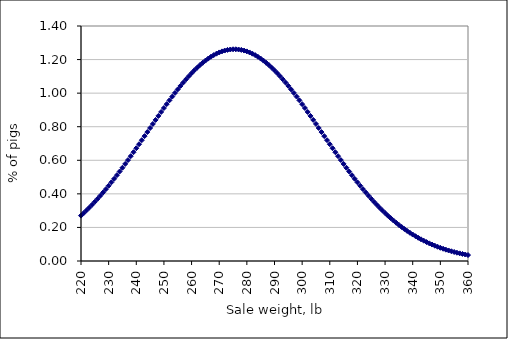
| Category | Series 0 |
|---|---|
| 150.0 | 0.004 |
| 151.0 | 0.001 |
| 152.0 | 0.001 |
| 153.0 | 0.001 |
| 154.0 | 0.001 |
| 155.0 | 0.001 |
| 156.0 | 0.001 |
| 157.0 | 0.001 |
| 158.0 | 0.001 |
| 159.0 | 0.001 |
| 160.0 | 0.002 |
| 161.0 | 0.002 |
| 162.0 | 0.002 |
| 163.0 | 0.002 |
| 164.0 | 0.003 |
| 165.0 | 0.003 |
| 166.0 | 0.003 |
| 167.0 | 0.004 |
| 168.0 | 0.004 |
| 169.0 | 0.004 |
| 170.0 | 0.005 |
| 171.0 | 0.005 |
| 172.0 | 0.006 |
| 173.0 | 0.007 |
| 174.0 | 0.007 |
| 175.0 | 0.008 |
| 176.0 | 0.009 |
| 177.0 | 0.01 |
| 178.0 | 0.011 |
| 179.0 | 0.012 |
| 180.0 | 0.013 |
| 181.0 | 0.015 |
| 182.0 | 0.016 |
| 183.0 | 0.018 |
| 184.0 | 0.019 |
| 185.0 | 0.021 |
| 186.0 | 0.023 |
| 187.0 | 0.025 |
| 188.0 | 0.027 |
| 189.0 | 0.03 |
| 190.0 | 0.033 |
| 191.0 | 0.036 |
| 192.0 | 0.039 |
| 193.0 | 0.042 |
| 194.0 | 0.046 |
| 195.0 | 0.049 |
| 196.0 | 0.054 |
| 197.0 | 0.058 |
| 198.0 | 0.063 |
| 199.0 | 0.068 |
| 200.0 | 0.073 |
| 201.0 | 0.079 |
| 202.0 | 0.085 |
| 203.0 | 0.091 |
| 204.0 | 0.098 |
| 205.0 | 0.105 |
| 206.0 | 0.113 |
| 207.0 | 0.121 |
| 208.0 | 0.129 |
| 209.0 | 0.138 |
| 210.0 | 0.148 |
| 211.0 | 0.158 |
| 212.0 | 0.168 |
| 213.0 | 0.179 |
| 214.0 | 0.19 |
| 215.0 | 0.202 |
| 216.0 | 0.215 |
| 217.0 | 0.228 |
| 218.0 | 0.242 |
| 219.0 | 0.256 |
| 220.0 | 0.27 |
| 221.0 | 0.286 |
| 222.0 | 0.302 |
| 223.0 | 0.318 |
| 224.0 | 0.335 |
| 225.0 | 0.353 |
| 226.0 | 0.371 |
| 227.0 | 0.389 |
| 228.0 | 0.408 |
| 229.0 | 0.428 |
| 230.0 | 0.448 |
| 231.0 | 0.469 |
| 232.0 | 0.49 |
| 233.0 | 0.511 |
| 234.0 | 0.533 |
| 235.0 | 0.556 |
| 236.0 | 0.578 |
| 237.0 | 0.601 |
| 238.0 | 0.625 |
| 239.0 | 0.648 |
| 240.0 | 0.672 |
| 241.0 | 0.696 |
| 242.0 | 0.72 |
| 243.0 | 0.744 |
| 244.0 | 0.768 |
| 245.0 | 0.792 |
| 246.0 | 0.816 |
| 247.0 | 0.84 |
| 248.0 | 0.864 |
| 249.0 | 0.888 |
| 250.0 | 0.911 |
| 251.0 | 0.934 |
| 252.0 | 0.957 |
| 253.0 | 0.979 |
| 254.0 | 1.001 |
| 255.0 | 1.022 |
| 256.0 | 1.043 |
| 257.0 | 1.063 |
| 258.0 | 1.082 |
| 259.0 | 1.101 |
| 260.0 | 1.119 |
| 261.0 | 1.136 |
| 262.0 | 1.152 |
| 263.0 | 1.167 |
| 264.0 | 1.181 |
| 265.0 | 1.194 |
| 266.0 | 1.206 |
| 267.0 | 1.217 |
| 268.0 | 1.226 |
| 269.0 | 1.235 |
| 270.0 | 1.242 |
| 271.0 | 1.249 |
| 272.0 | 1.254 |
| 273.0 | 1.257 |
| 274.0 | 1.26 |
| 275.0 | 1.261 |
| 276.0 | 1.261 |
| 277.0 | 1.26 |
| 278.0 | 1.257 |
| 279.0 | 1.254 |
| 280.0 | 1.249 |
| 281.0 | 1.242 |
| 282.0 | 1.235 |
| 283.0 | 1.226 |
| 284.0 | 1.217 |
| 285.0 | 1.206 |
| 286.0 | 1.194 |
| 287.0 | 1.181 |
| 288.0 | 1.167 |
| 289.0 | 1.152 |
| 290.0 | 1.136 |
| 291.0 | 1.119 |
| 292.0 | 1.101 |
| 293.0 | 1.082 |
| 294.0 | 1.063 |
| 295.0 | 1.043 |
| 296.0 | 1.022 |
| 297.0 | 1.001 |
| 298.0 | 0.979 |
| 299.0 | 0.957 |
| 300.0 | 0.934 |
| 301.0 | 0.911 |
| 302.0 | 0.888 |
| 303.0 | 0.864 |
| 304.0 | 0.84 |
| 305.0 | 0.816 |
| 306.0 | 0.792 |
| 307.0 | 0.768 |
| 308.0 | 0.744 |
| 309.0 | 0.72 |
| 310.0 | 0.696 |
| 311.0 | 0.672 |
| 312.0 | 0.648 |
| 313.0 | 0.625 |
| 314.0 | 0.601 |
| 315.0 | 0.578 |
| 316.0 | 0.556 |
| 317.0 | 0.533 |
| 318.0 | 0.511 |
| 319.0 | 0.49 |
| 320.0 | 0.469 |
| 321.0 | 0.448 |
| 322.0 | 0.428 |
| 323.0 | 0.408 |
| 324.0 | 0.389 |
| 325.0 | 0.371 |
| 326.0 | 0.353 |
| 327.0 | 0.335 |
| 328.0 | 0.318 |
| 329.0 | 0.302 |
| 330.0 | 0.286 |
| 331.0 | 0.27 |
| 332.0 | 0.256 |
| 333.0 | 0.242 |
| 334.0 | 0.228 |
| 335.0 | 0.215 |
| 336.0 | 0.202 |
| 337.0 | 0.19 |
| 338.0 | 0.179 |
| 339.0 | 0.168 |
| 340.0 | 0.158 |
| 341.0 | 0.148 |
| 342.0 | 0.138 |
| 343.0 | 0.129 |
| 344.0 | 0.121 |
| 345.0 | 0.113 |
| 346.0 | 0.105 |
| 347.0 | 0.098 |
| 348.0 | 0.091 |
| 349.0 | 0.085 |
| 350.0 | 0.079 |
| 351.0 | 0.073 |
| 352.0 | 0.068 |
| 353.0 | 0.063 |
| 354.0 | 0.058 |
| 355.0 | 0.054 |
| 356.0 | 0.049 |
| 357.0 | 0.046 |
| 358.0 | 0.042 |
| 359.0 | 0.039 |
| 360.0 | 0.036 |
| 361.0 | 0.033 |
| 362.0 | 0.03 |
| 363.0 | 0.027 |
| 364.0 | 0.025 |
| 365.0 | 0.023 |
| 366.0 | 0.021 |
| 367.0 | 0.019 |
| 368.0 | 0.018 |
| 369.0 | 0.016 |
| 370.0 | 0.015 |
| 371.0 | 0.013 |
| 372.0 | 0.012 |
| 373.0 | 0.011 |
| 374.0 | 0.01 |
| 375.0 | 0.009 |